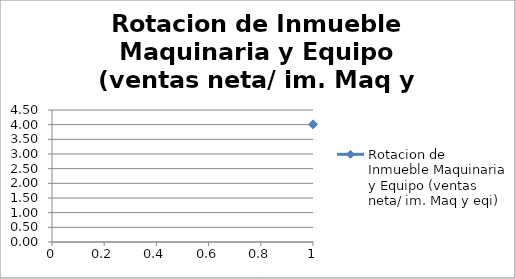
| Category | Rotacion de Inmueble Maquinaria y Equipo (ventas neta/ im. Maq y eqi) |
|---|---|
| 0 | 4.011 |
| 1 | 4.011 |
| 2 | 4.011 |
| 3 | 4.011 |
| 4 | 4.011 |
| 5 | 4.011 |
| 6 | 4.011 |
| 7 | 4.011 |